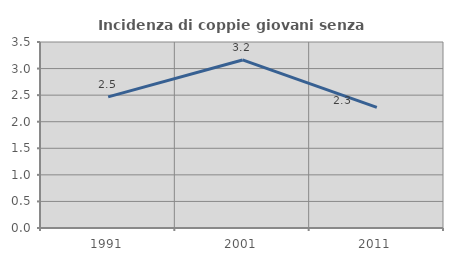
| Category | Incidenza di coppie giovani senza figli |
|---|---|
| 1991.0 | 2.467 |
| 2001.0 | 3.162 |
| 2011.0 | 2.269 |